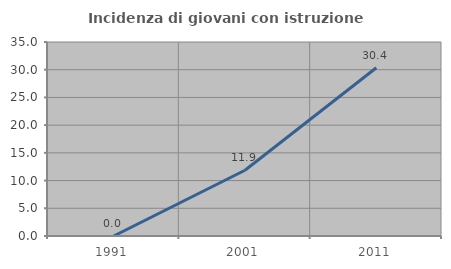
| Category | Incidenza di giovani con istruzione universitaria |
|---|---|
| 1991.0 | 0 |
| 2001.0 | 11.864 |
| 2011.0 | 30.357 |